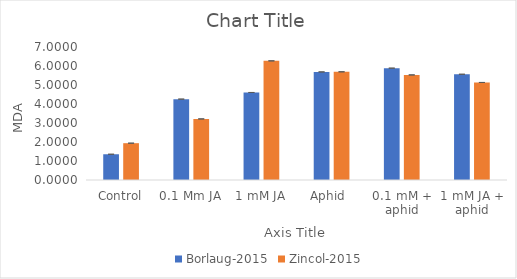
| Category | Borlaug-2015 | Zincol-2015 |
|---|---|---|
| Control | 1.355 | 1.938 |
| 0.1 Mm JA | 4.256 | 3.215 |
| 1 mM JA | 4.606 | 6.271 |
| Aphid  | 5.688 | 5.695 |
| 0.1 mM + aphid | 5.886 | 5.531 |
| 1 mM JA + aphid | 5.566 | 5.133 |